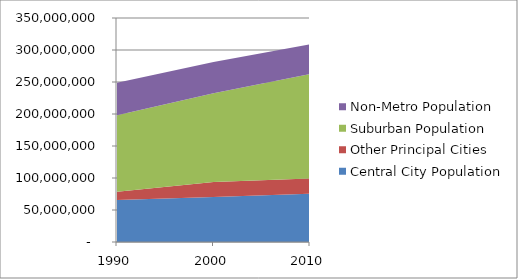
| Category | Central City Population | Other Principal Cities | Suburban Population | Non-Metro Population |
|---|---|---|---|---|
| 1990.0 | 65793580 | 12886116 | 119558148 | 50472029 |
| 2000.0 | 70287434 | 23561873 | 138730633 | 48841966 |
| 2010.0 | 75283196 | 24065670 | 163103266 | 46293406 |